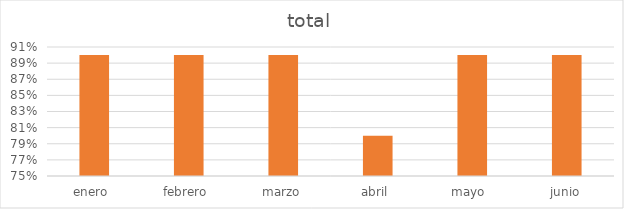
| Category | total |
|---|---|
| enero  | 0.9 |
| febrero  | 0.9 |
| marzo | 0.9 |
| abril  | 0.8 |
| mayo  | 0.9 |
| junio | 0.9 |